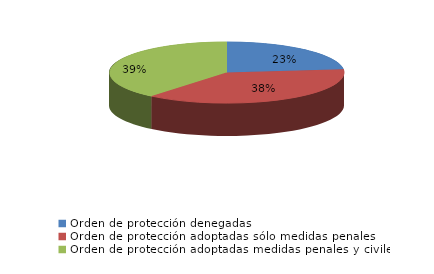
| Category | Series 0 |
|---|---|
| Orden de protección denegadas | 75 |
| Orden de protección adoptadas sólo medidas penales | 122 |
| Orden de protección adoptadas medidas penales y civiles | 126 |